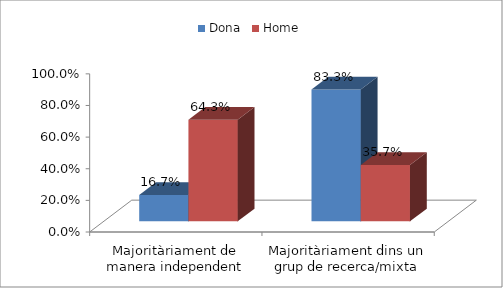
| Category | Dona | Home |
|---|---|---|
| Majoritàriament de manera independent | 0.167 | 0.643 |
| Majoritàriament dins un grup de recerca/mixta | 0.833 | 0.357 |